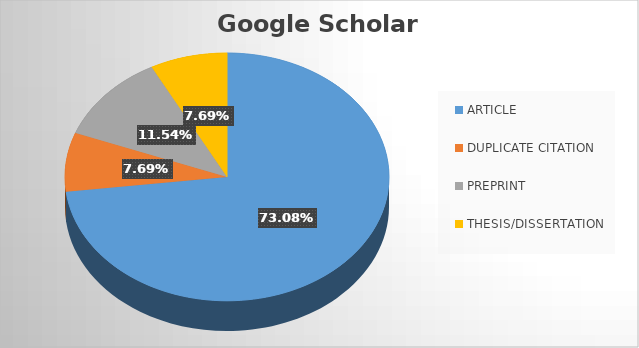
| Category | Total |
|---|---|
| ARTICLE | 19 |
| DUPLICATE CITATION | 2 |
| PREPRINT | 3 |
| THESIS/DISSERTATION | 2 |